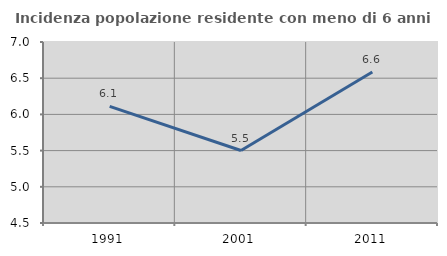
| Category | Incidenza popolazione residente con meno di 6 anni |
|---|---|
| 1991.0 | 6.111 |
| 2001.0 | 5.501 |
| 2011.0 | 6.586 |